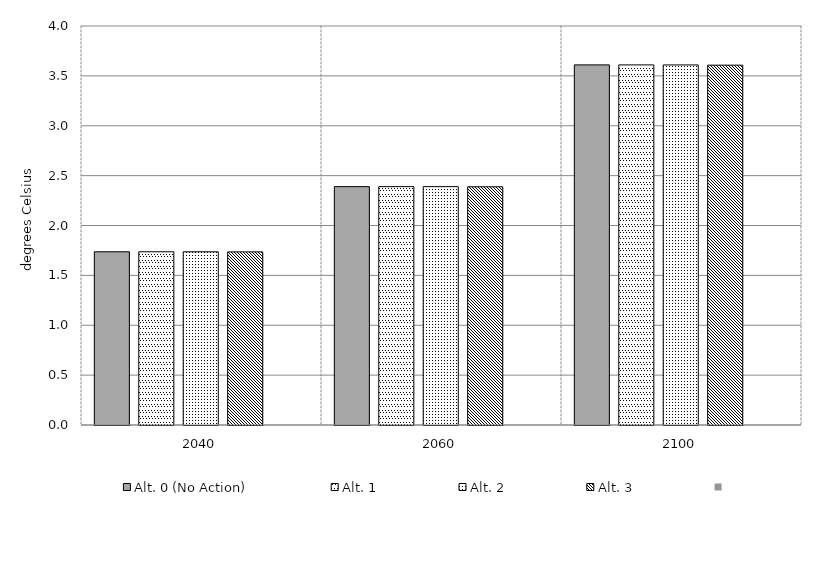
| Category | Alt. 0 (No Action) | Alt. 1 | Alt. 2 | Alt. 3 | Series 4 | Alt 5 | Alt 6 | Alt 7 | Alt 8 | Alt 10 |
|---|---|---|---|---|---|---|---|---|---|---|
| 2040.0 | 1.737 | 1.736 | 1.736 | 1.735 |  |  |  |  |  |  |
| 2060.0 | 2.39 | 2.39 | 2.389 | 2.388 |  |  |  |  |  |  |
| 2100.0 | 3.61 | 3.61 | 3.61 | 3.607 |  |  |  |  |  |  |